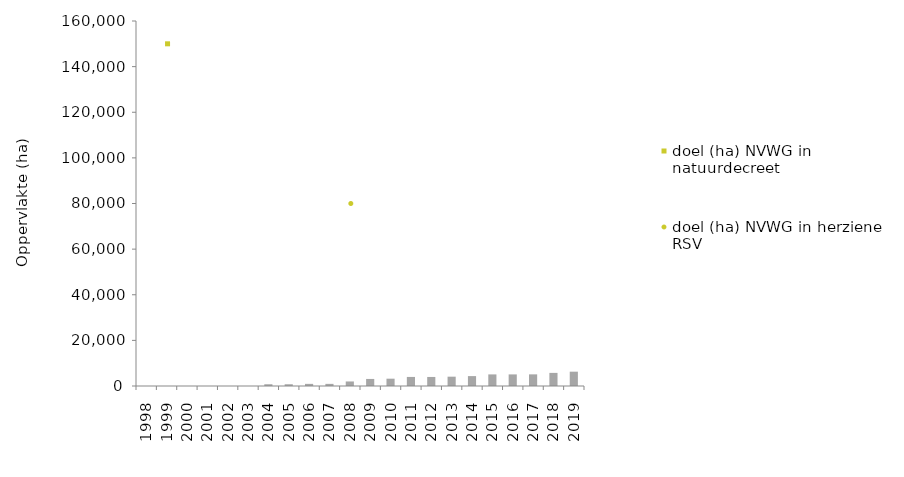
| Category | afgebakend (ha) NVWG |
|---|---|
| 1998.0 | 0 |
| 1999.0 | 0 |
| 2000.0 | 0 |
| 2001.0 | 0 |
| 2002.0 | 0 |
| 2003.0 | 0 |
| 2004.0 | 768 |
| 2005.0 | 768 |
| 2006.0 | 934 |
| 2007.0 | 934 |
| 2008.0 | 1992 |
| 2009.0 | 3094 |
| 2010.0 | 3203 |
| 2011.0 | 3973.935 |
| 2012.0 | 3964.499 |
| 2013.0 | 4089.393 |
| 2014.0 | 4337.77 |
| 2015.0 | 5084.317 |
| 2016.0 | 5084.317 |
| 2017.0 | 5102.802 |
| 2018.0 | 5745.058 |
| 2019.0 | 6277.118 |